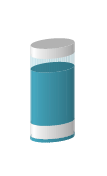
| Category | Series 0 | Series 1 | Series 2 | Series 3 | Series 4 |
|---|---|---|---|---|---|
| بندرعباس | 0.05 | 0.2 | 0.796 | 0.204 | 0.15 |